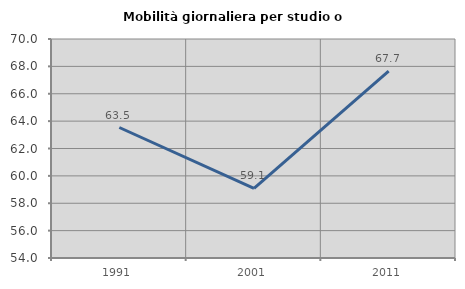
| Category | Mobilità giornaliera per studio o lavoro |
|---|---|
| 1991.0 | 63.534 |
| 2001.0 | 59.079 |
| 2011.0 | 67.656 |